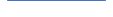
| Category | Series 0 |
|---|---|
| 0 | 358 |
| 1 | 337 |
| 2 | 280 |
| 3 | 267 |
| 4 | 272 |
| 5 | 252 |
| 6 | 403 |
| 7 | 377 |
| 8 | 348 |